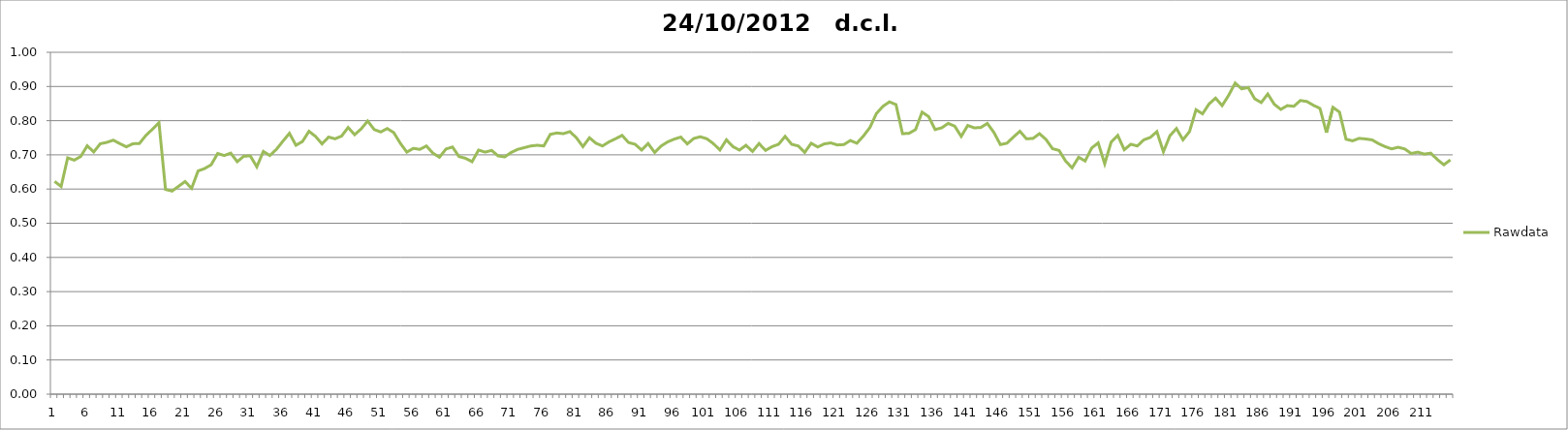
| Category | Rawdata |
|---|---|
| 0 | 0.622 |
| 1 | 0.608 |
| 2 | 0.691 |
| 3 | 0.685 |
| 4 | 0.695 |
| 5 | 0.727 |
| 6 | 0.709 |
| 7 | 0.733 |
| 8 | 0.736 |
| 9 | 0.743 |
| 10 | 0.733 |
| 11 | 0.724 |
| 12 | 0.733 |
| 13 | 0.733 |
| 14 | 0.757 |
| 15 | 0.775 |
| 16 | 0.794 |
| 17 | 0.599 |
| 18 | 0.594 |
| 19 | 0.608 |
| 20 | 0.622 |
| 21 | 0.602 |
| 22 | 0.653 |
| 23 | 0.66 |
| 24 | 0.671 |
| 25 | 0.704 |
| 26 | 0.698 |
| 27 | 0.705 |
| 28 | 0.68 |
| 29 | 0.696 |
| 30 | 0.697 |
| 31 | 0.665 |
| 32 | 0.71 |
| 33 | 0.698 |
| 34 | 0.716 |
| 35 | 0.74 |
| 36 | 0.763 |
| 37 | 0.728 |
| 38 | 0.739 |
| 39 | 0.769 |
| 40 | 0.754 |
| 41 | 0.732 |
| 42 | 0.752 |
| 43 | 0.747 |
| 44 | 0.755 |
| 45 | 0.78 |
| 46 | 0.759 |
| 47 | 0.776 |
| 48 | 0.799 |
| 49 | 0.774 |
| 50 | 0.767 |
| 51 | 0.777 |
| 52 | 0.765 |
| 53 | 0.734 |
| 54 | 0.708 |
| 55 | 0.719 |
| 56 | 0.716 |
| 57 | 0.726 |
| 58 | 0.705 |
| 59 | 0.693 |
| 60 | 0.717 |
| 61 | 0.723 |
| 62 | 0.695 |
| 63 | 0.69 |
| 64 | 0.68 |
| 65 | 0.714 |
| 66 | 0.708 |
| 67 | 0.713 |
| 68 | 0.697 |
| 69 | 0.694 |
| 70 | 0.707 |
| 71 | 0.716 |
| 72 | 0.721 |
| 73 | 0.726 |
| 74 | 0.728 |
| 75 | 0.726 |
| 76 | 0.76 |
| 77 | 0.764 |
| 78 | 0.762 |
| 79 | 0.768 |
| 80 | 0.75 |
| 81 | 0.724 |
| 82 | 0.75 |
| 83 | 0.734 |
| 84 | 0.726 |
| 85 | 0.738 |
| 86 | 0.747 |
| 87 | 0.757 |
| 88 | 0.736 |
| 89 | 0.731 |
| 90 | 0.714 |
| 91 | 0.733 |
| 92 | 0.707 |
| 93 | 0.726 |
| 94 | 0.738 |
| 95 | 0.746 |
| 96 | 0.752 |
| 97 | 0.732 |
| 98 | 0.748 |
| 99 | 0.753 |
| 100 | 0.747 |
| 101 | 0.733 |
| 102 | 0.714 |
| 103 | 0.744 |
| 104 | 0.724 |
| 105 | 0.714 |
| 106 | 0.728 |
| 107 | 0.71 |
| 108 | 0.733 |
| 109 | 0.713 |
| 110 | 0.724 |
| 111 | 0.731 |
| 112 | 0.754 |
| 113 | 0.731 |
| 114 | 0.726 |
| 115 | 0.707 |
| 116 | 0.734 |
| 117 | 0.723 |
| 118 | 0.732 |
| 119 | 0.735 |
| 120 | 0.729 |
| 121 | 0.73 |
| 122 | 0.742 |
| 123 | 0.734 |
| 124 | 0.755 |
| 125 | 0.78 |
| 126 | 0.821 |
| 127 | 0.842 |
| 128 | 0.855 |
| 129 | 0.847 |
| 130 | 0.762 |
| 131 | 0.763 |
| 132 | 0.774 |
| 133 | 0.825 |
| 134 | 0.812 |
| 135 | 0.774 |
| 136 | 0.779 |
| 137 | 0.792 |
| 138 | 0.784 |
| 139 | 0.754 |
| 140 | 0.786 |
| 141 | 0.779 |
| 142 | 0.78 |
| 143 | 0.792 |
| 144 | 0.766 |
| 145 | 0.73 |
| 146 | 0.734 |
| 147 | 0.752 |
| 148 | 0.769 |
| 149 | 0.747 |
| 150 | 0.748 |
| 151 | 0.762 |
| 152 | 0.745 |
| 153 | 0.718 |
| 154 | 0.713 |
| 155 | 0.682 |
| 156 | 0.662 |
| 157 | 0.693 |
| 158 | 0.682 |
| 159 | 0.72 |
| 160 | 0.735 |
| 161 | 0.674 |
| 162 | 0.738 |
| 163 | 0.757 |
| 164 | 0.715 |
| 165 | 0.731 |
| 166 | 0.726 |
| 167 | 0.744 |
| 168 | 0.751 |
| 169 | 0.768 |
| 170 | 0.709 |
| 171 | 0.756 |
| 172 | 0.777 |
| 173 | 0.744 |
| 174 | 0.768 |
| 175 | 0.832 |
| 176 | 0.82 |
| 177 | 0.849 |
| 178 | 0.866 |
| 179 | 0.844 |
| 180 | 0.874 |
| 181 | 0.91 |
| 182 | 0.893 |
| 183 | 0.897 |
| 184 | 0.864 |
| 185 | 0.853 |
| 186 | 0.878 |
| 187 | 0.848 |
| 188 | 0.833 |
| 189 | 0.844 |
| 190 | 0.842 |
| 191 | 0.859 |
| 192 | 0.856 |
| 193 | 0.845 |
| 194 | 0.836 |
| 195 | 0.765 |
| 196 | 0.839 |
| 197 | 0.825 |
| 198 | 0.746 |
| 199 | 0.741 |
| 200 | 0.748 |
| 201 | 0.746 |
| 202 | 0.744 |
| 203 | 0.733 |
| 204 | 0.724 |
| 205 | 0.718 |
| 206 | 0.722 |
| 207 | 0.717 |
| 208 | 0.704 |
| 209 | 0.708 |
| 210 | 0.702 |
| 211 | 0.705 |
| 212 | 0.686 |
| 213 | 0.671 |
| 214 | 0.685 |